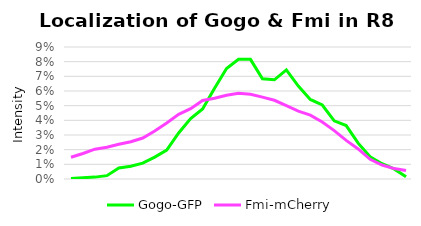
| Category | Gogo-GFP | Fmi-mCherry |
|---|---|---|
| 0 | 0 | 0.015 |
| 1 | 0.001 | 0.017 |
| 2 | 0.001 | 0.02 |
| 3 | 0.002 | 0.022 |
| 4 | 0.008 | 0.024 |
| 5 | 0.009 | 0.025 |
| 6 | 0.011 | 0.028 |
| 7 | 0.015 | 0.033 |
| 8 | 0.02 | 0.038 |
| 9 | 0.031 | 0.044 |
| 10 | 0.041 | 0.048 |
| 11 | 0.048 | 0.054 |
| 12 | 0.062 | 0.055 |
| 13 | 0.075 | 0.057 |
| 14 | 0.082 | 0.059 |
| 15 | 0.082 | 0.058 |
| 16 | 0.068 | 0.056 |
| 17 | 0.068 | 0.054 |
| 18 | 0.074 | 0.05 |
| 19 | 0.063 | 0.046 |
| 20 | 0.054 | 0.044 |
| 21 | 0.05 | 0.039 |
| 22 | 0.04 | 0.033 |
| 23 | 0.036 | 0.026 |
| 24 | 0.024 | 0.02 |
| 25 | 0.015 | 0.013 |
| 26 | 0.01 | 0.01 |
| 27 | 0.007 | 0.007 |
| 28 | 0.001 | 0.006 |